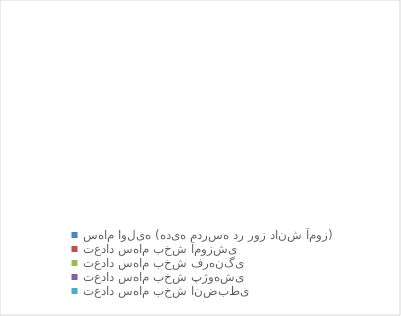
| Category | Series 0 | Series 1 |
|---|---|---|
| سهام اولیه (هدیه مدرسه در روز دانش آموز) | 0 |  |
| تعداد سهام بخش آموزشی | 0 |  |
| تعداد سهام بخش فرهنگی | 0 |  |
| تعداد سهام بخش پژوهشی | 0 |  |
| تعداد سهام بخش انضبطی | 0 |  |